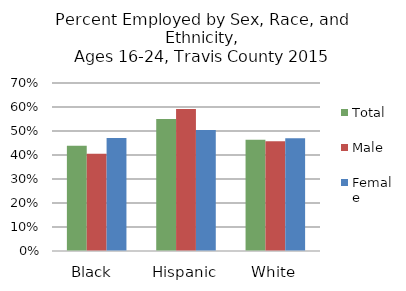
| Category | Total  | Male  | Female |
|---|---|---|---|
| Black  | 0.438 | 0.405 | 0.471 |
| Hispanic | 0.55 | 0.592 | 0.504 |
| White | 0.464 | 0.458 | 0.47 |